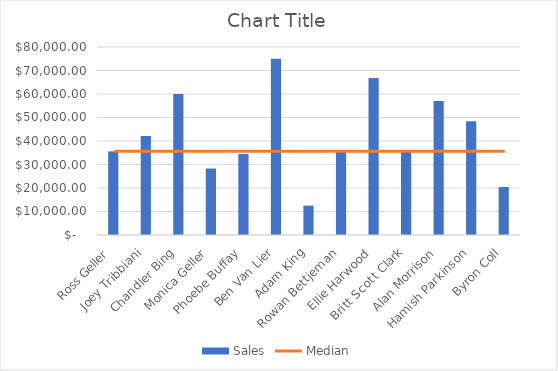
| Category |  Sales  |
|---|---|
| Ross Geller | 35600 |
| Joey Tribbiani | 42150 |
| Chandler Bing | 60000 |
| Monica Geller | 28300 |
| Phoebe Buffay | 34500 |
| Ben Van Lier | 75000 |
| Adam King | 12500 |
| Rowan Bettjeman | 35623 |
| Ellie Harwood | 66785 |
| Britt Scott Clark | 35430 |
| Alan Morrison | 57020 |
| Hamish Parkinson | 48456 |
| Byron Coll | 20400 |